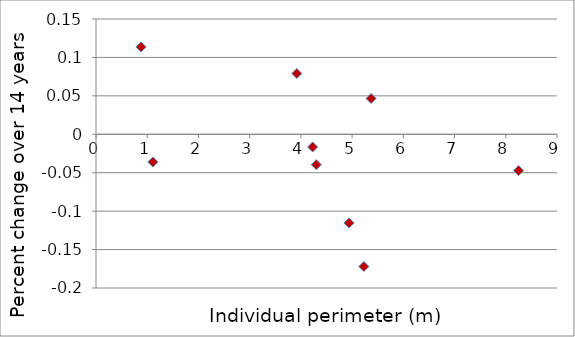
| Category | Series 0 |
|---|---|
| 0.88 | 0.114 |
| 1.11 | -0.036 |
| 3.92 | 0.079 |
| 4.23 | -0.017 |
| 4.3 | -0.04 |
| 4.94 | -0.115 |
| 5.23 | -0.172 |
| 5.37 | 0.047 |
| 8.25 | -0.047 |